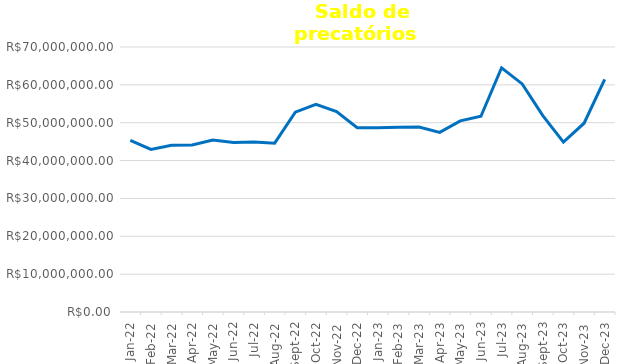
| Category | Precatórios |
|---|---|
| 2022-01-01 | 45323019.56 |
| 2022-02-01 | 42951833.28 |
| 2022-03-01 | 44050933.42 |
| 2022-04-01 | 44095535.02 |
| 2022-05-01 | 45422054.53 |
| 2022-06-01 | 44800254.68 |
| 2022-07-01 | 44936745.72 |
| 2022-08-01 | 44605781.41 |
| 2022-09-01 | 52792215.22 |
| 2022-10-01 | 54859507.79 |
| 2022-11-01 | 52947954.92 |
| 2022-12-01 | 48690884.42 |
| 2023-01-01 | 48666964.3 |
| 2023-02-01 | 48778973.22 |
| 2023-03-01 | 48873876.16 |
| 2023-04-01 | 47445180.82 |
| 2023-05-01 | 50485115.48 |
| 2023-06-01 | 51705326.41 |
| 2023-07-01 | 64515151.98 |
| 2023-08-01 | 60250448.57 |
| 2023-09-01 | 51874859.34 |
| 2023-10-01 | 44870611.8 |
| 2023-11-01 | 49866282.25 |
| 2023-12-01 | 61443766.28 |